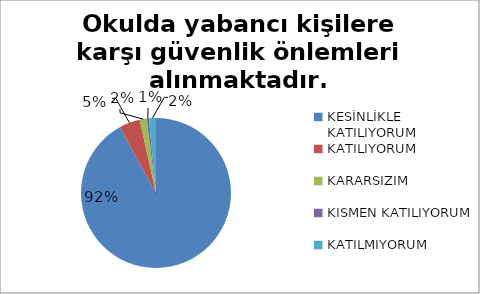
| Category | Okulda yabancı kişilere karşı güvenlik önlemleri alınmaktadır. |
|---|---|
| KESİNLİKLE KATILIYORUM | 184 |
| KATILIYORUM | 9 |
| KARARSIZIM | 3 |
| KISMEN KATILIYORUM | 1 |
| KATILMIYORUM | 3 |